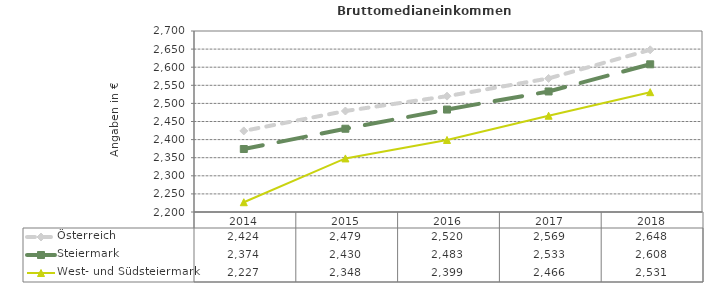
| Category | Österreich | Steiermark | West- und Südsteiermark |
|---|---|---|---|
| 2018.0 | 2648 | 2608 | 2531 |
| 2017.0 | 2569 | 2533 | 2466 |
| 2016.0 | 2520 | 2483 | 2399 |
| 2015.0 | 2479 | 2430 | 2348 |
| 2014.0 | 2424 | 2374 | 2227 |